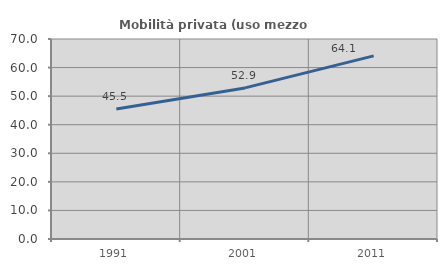
| Category | Mobilità privata (uso mezzo privato) |
|---|---|
| 1991.0 | 45.49 |
| 2001.0 | 52.879 |
| 2011.0 | 64.083 |